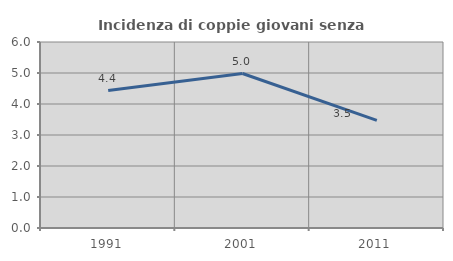
| Category | Incidenza di coppie giovani senza figli |
|---|---|
| 1991.0 | 4.433 |
| 2001.0 | 4.983 |
| 2011.0 | 3.471 |